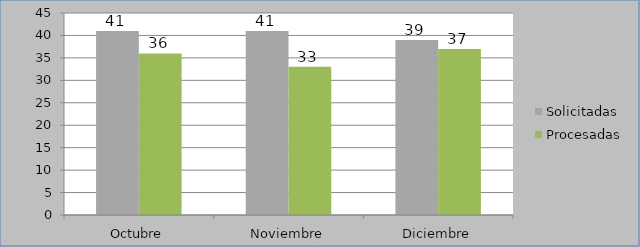
| Category | Solicitadas | Procesadas |
|---|---|---|
| Octubre | 41 | 36 |
| Noviembre | 41 | 33 |
| Diciembre | 39 | 37 |